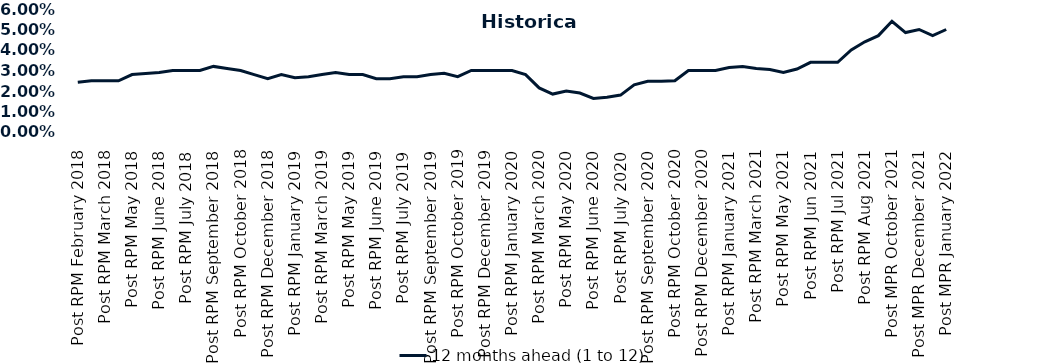
| Category | 12 months ahead (1 to 12)  |
|---|---|
| Post RPM February 2018 | 0.024 |
| Pre RPM March 2018 | 0.025 |
| Post RPM March 2018 | 0.025 |
| Pre RPM May 2018 | 0.025 |
| Post RPM May 2018 | 0.028 |
| Pre RPM June 2018 | 0.028 |
| Post RPM June 2018 | 0.029 |
| Pre RPM July 2018 | 0.03 |
| Post RPM July 2018 | 0.03 |
| Pre RPM September 2018 | 0.03 |
| Post RPM September 2018 | 0.032 |
| Pre RPM October 2018 | 0.031 |
| Post RPM October 2018 | 0.03 |
| Pre RPM December 2018 | 0.028 |
| Post RPM December 2018 | 0.026 |
| Pre RPM January 2019 | 0.028 |
| Post RPM January 2019 | 0.026 |
| Pre RPM March 2019 | 0.027 |
| Post RPM March 2019 | 0.028 |
| Pre RPM May 2019 | 0.029 |
| Post RPM May 2019 | 0.028 |
| Pre RPM June 2019 | 0.028 |
| Post RPM June 2019 | 0.026 |
| Pre RPM July 2019 | 0.026 |
| Post RPM July 2019 | 0.027 |
| Pre RPM September 2019 | 0.027 |
| Post RPM September 2019 | 0.028 |
| Pre RPM October 2019 | 0.029 |
| Post RPM October 2019 | 0.027 |
| Pre RPM December 2019 | 0.03 |
| Post RPM December 2019 | 0.03 |
| Pre RPM January 2020 | 0.03 |
| Post RPM January 2020 | 0.03 |
| Pre RPM March 2020 | 0.028 |
| Post RPM March 2020 | 0.022 |
| Pre RPM May 2020 | 0.018 |
| Post RPM May 2020 | 0.02 |
| Pre RPM June 2020 | 0.019 |
| Post RPM June 2020 | 0.016 |
| Pre RPM July 2020 | 0.017 |
| Post RPM July 2020 | 0.018 |
| Pre RPM September 2020 | 0.023 |
| Post RPM September 2020 | 0.025 |
| Pre RPM October 2020 | 0.025 |
| Post RPM October 2020 | 0.025 |
| Pre RPM December 2020 | 0.03 |
|  Post RPM December 2020 | 0.03 |
| Pre RPM January 2021 | 0.03 |
| Post RPM January 2021 | 0.032 |
|  Pre RPM March 2021 | 0.032 |
|  Post RPM March 2021 | 0.031 |
|  Pre RPM May 2021 | 0.03 |
|  Post RPM May 2021 | 0.029 |
|  Pre RPM Jun 2021 | 0.031 |
|   Post RPM Jun 2021 | 0.034 |
| Pre RPM Jul 2021 | 0.034 |
|  Post RPM Jul 2021 | 0.034 |
| Pre RPM Aug 2021 | 0.04 |
|  Post RPM Aug 2021 | 0.044 |
| Pre MPR October 2021 | 0.047 |
| Post MPR October 2021 | 0.054 |
| Pre MPR December 2021 | 0.048 |
| Post MPR December 2021 | 0.05 |
| Pre MPR January 2022 | 0.047 |
| Post MPR January 2022 | 0.05 |